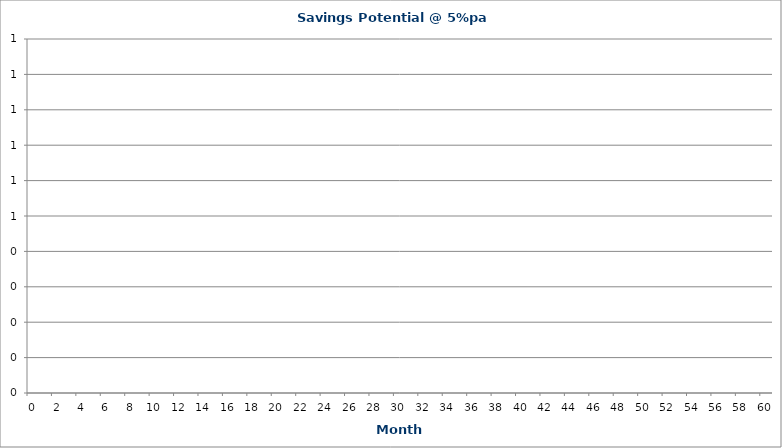
| Category | Series 0 |
|---|---|
| 0.0 | 0 |
| 1.0 | 0 |
| 2.0 | 0 |
| 3.0 | 0 |
| 4.0 | 0 |
| 5.0 | 0 |
| 6.0 | 0 |
| 7.0 | 0 |
| 8.0 | 0 |
| 9.0 | 0 |
| 10.0 | 0 |
| 11.0 | 0 |
| 12.0 | 0 |
| 13.0 | 0 |
| 14.0 | 0 |
| 15.0 | 0 |
| 16.0 | 0 |
| 17.0 | 0 |
| 18.0 | 0 |
| 19.0 | 0 |
| 20.0 | 0 |
| 21.0 | 0 |
| 22.0 | 0 |
| 23.0 | 0 |
| 24.0 | 0 |
| 25.0 | 0 |
| 26.0 | 0 |
| 27.0 | 0 |
| 28.0 | 0 |
| 29.0 | 0 |
| 30.0 | 0 |
| 31.0 | 0 |
| 32.0 | 0 |
| 33.0 | 0 |
| 34.0 | 0 |
| 35.0 | 0 |
| 36.0 | 0 |
| 37.0 | 0 |
| 38.0 | 0 |
| 39.0 | 0 |
| 40.0 | 0 |
| 41.0 | 0 |
| 42.0 | 0 |
| 43.0 | 0 |
| 44.0 | 0 |
| 45.0 | 0 |
| 46.0 | 0 |
| 47.0 | 0 |
| 48.0 | 0 |
| 49.0 | 0 |
| 50.0 | 0 |
| 51.0 | 0 |
| 52.0 | 0 |
| 53.0 | 0 |
| 54.0 | 0 |
| 55.0 | 0 |
| 56.0 | 0 |
| 57.0 | 0 |
| 58.0 | 0 |
| 59.0 | 0 |
| 60.0 | 0 |